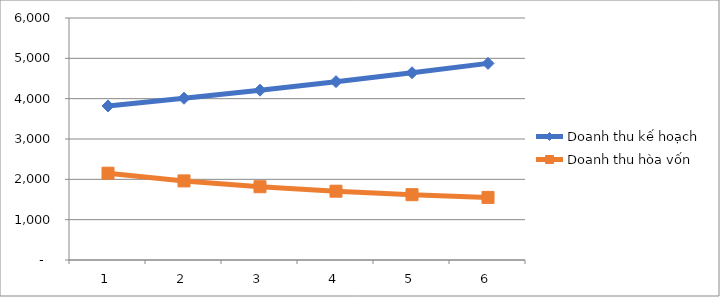
| Category | Doanh thu kế hoạch | Doanh thu hòa vốn |
|---|---|---|
| 0 | 3819.375 | 2152.328 |
| 1 | 4010.344 | 1961.166 |
| 2 | 4210.861 | 1816.884 |
| 3 | 4421.404 | 1705.924 |
| 4 | 4642.474 | 1619.634 |
| 5 | 4874.598 | 1552.241 |